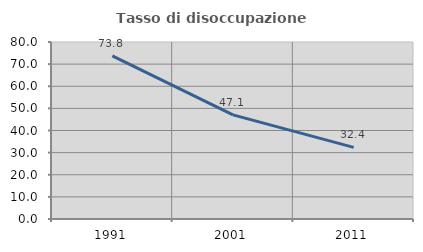
| Category | Tasso di disoccupazione giovanile  |
|---|---|
| 1991.0 | 73.755 |
| 2001.0 | 47.059 |
| 2011.0 | 32.384 |